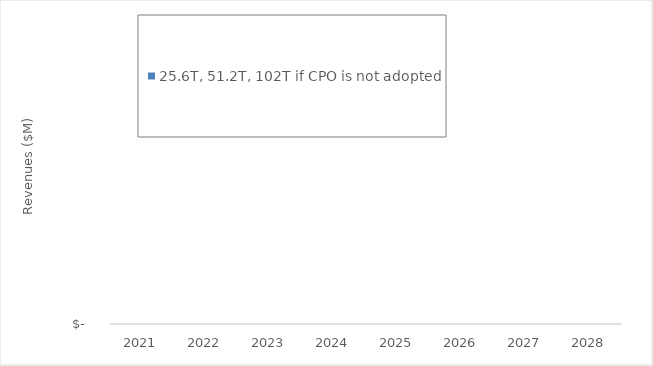
| Category | 25.6T, 51.2T, 102T if CPO is not adopted |
|---|---|
| 2021.0 | 0 |
| 2022.0 | 0 |
| 2023.0 | 0 |
| 2024.0 | 0 |
| 2025.0 | 0 |
| 2026.0 | 0 |
| 2027.0 | 0 |
| 2028.0 | 0 |